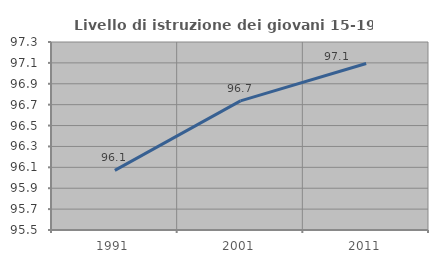
| Category | Livello di istruzione dei giovani 15-19 anni |
|---|---|
| 1991.0 | 96.07 |
| 2001.0 | 96.736 |
| 2011.0 | 97.094 |